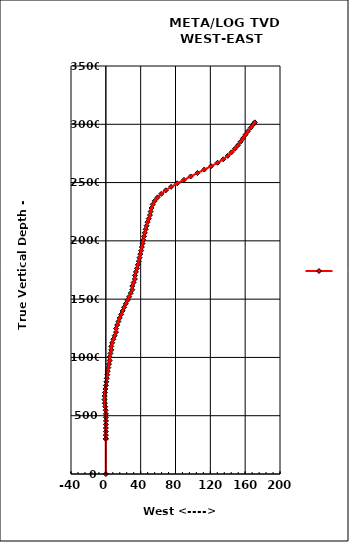
| Category | Series 0 |
|---|---|
| 0.0 | 0 |
| 0.0 | 300.639 |
| 0.013965185908719738 | 303.064 |
| 0.027930371817439476 | 333.539 |
| 0.041895557726159216 | 364.014 |
| 0.05586074363487896 | 394.49 |
| 0.0698259295435987 | 424.965 |
| 0.08379111545231845 | 455.44 |
| 0.09775630136103819 | 485.916 |
| 0.11172148726975793 | 516.391 |
| -0.2058657351733637 | 546.866 |
| -0.702585359210208 | 577.343 |
| -1.1266549915286492 | 607.827 |
| -1.5507246238470904 | 638.292 |
| -1.3293430640074384 | 668.758 |
| -0.964270823102273 | 699.224 |
| -0.4439738167978182 | 729.683 |
| 0.07632318950663652 | 760.141 |
| 0.5966201958110913 | 790.599 |
| 1.116917202115546 | 821.058 |
| 1.6372142084200008 | 851.516 |
| 2.1575112147244555 | 881.974 |
| 2.8879303756338577 | 912.432 |
| 3.61834953654326 | 942.883 |
| 4.440369485261798 | 973.334 |
| 4.440369485261798 | 1003.783 |
| 5.343174369826439 | 1034.222 |
| 6.24597925439108 | 1064.68 |
| 6.24597925439108 | 1095.137 |
| 7.304229898974679 | 1125.577 |
| 8.615191164608094 | 1156.013 |
| 10.164916974648698 | 1186.439 |
| 11.714642784689302 | 1216.844 |
| 11.714642784689302 | 1247.249 |
| 13.031951343151459 | 1277.666 |
| 14.485911561799153 | 1308.072 |
| 15.939871780446847 | 1338.465 |
| 17.607116673360316 | 1368.858 |
| 19.2316854145299 | 1399.245 |
| 20.953943419207263 | 1429.618 |
| 22.907445994144563 | 1459.981 |
| 24.884707814833817 | 1490.349 |
| 26.796738712763464 | 1520.727 |
| 28.633137365498065 | 1551.125 |
| 30.401749088444532 | 1581.536 |
| 30.401749088444532 | 1611.965 |
| 31.880734856752994 | 1642.398 |
| 33.359720625061456 | 1672.841 |
| 33.359720625061456 | 1703.284 |
| 34.56484107338131 | 1733.742 |
| 35.76996152170116 | 1764.202 |
| 36.80578214063005 | 1794.662 |
| 37.84160275955894 | 1825.13 |
| 38.701570916138195 | 1855.599 |
| 39.64351408773934 | 1886.049 |
| 40.58545725934049 | 1916.518 |
| 41.36309386191648 | 1946.986 |
| 42.18225708942178 | 1977.437 |
| 43.04560835332796 | 2007.885 |
| 43.90895961723413 | 2038.345 |
| 44.77231088114031 | 2068.805 |
| 45.75884144203979 | 2099.266 |
| 46.792233331551316 | 2129.714 |
| 47.86090270063745 | 2160.151 |
| 49.255174956063215 | 2190.578 |
| 50.6328645244252 | 2220.989 |
| 51.48060175141947 | 2251.406 |
| 52.39655915575865 | 2281.836 |
| 53.85248959425663 | 2312.285 |
| 56.18951107819585 | 2342.721 |
| 59.41858134395589 | 2373.1 |
| 63.65588084225032 | 2403.391 |
| 68.8607191515023 | 2433.564 |
| 74.98193716470824 | 2463.593 |
| 82.07164696107604 | 2493.448 |
| 89.73413164183248 | 2523.071 |
| 97.43159080145863 | 2552.497 |
| 105.20813581257899 | 2581.892 |
| 113.02274795172578 | 2611.295 |
| 120.85814150887275 | 2640.644 |
| 128.28981939554703 | 2670.039 |
| 134.8079664830994 | 2699.568 |
| 139.99734487529506 | 2729.33 |
| 144.25320093071377 | 2759.35 |
| 148.16857270360546 | 2789.519 |
| 151.66543503568843 | 2819.745 |
| 154.71109678437554 | 2850.024 |
| 157.53103043686923 | 2880.354 |
| 160.35096408936292 | 2910.707 |
| 163.2206382457788 | 2941.06 |
| 166.47576166213582 | 2971.399 |
| 169.73088507849286 | 3001.699 |
| 170.2011145672681 | 3005.94 |
| 170.99193655458248 | 3016.847 |